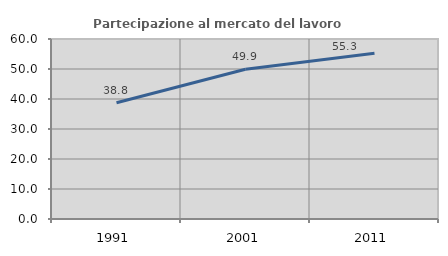
| Category | Partecipazione al mercato del lavoro  femminile |
|---|---|
| 1991.0 | 38.751 |
| 2001.0 | 49.939 |
| 2011.0 | 55.254 |